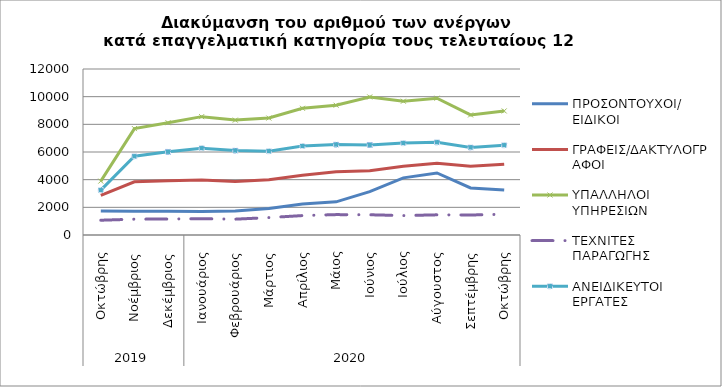
| Category | ΠΡΟΣΟΝΤΟΥΧΟΙ/  ΕΙΔΙΚΟΙ | ΓΡΑΦΕΙΣ/ΔΑΚΤΥΛΟΓΡΑΦΟΙ | ΥΠΑΛΛΗΛΟΙ ΥΠΗΡΕΣΙΩΝ | ΤΕΧΝΙΤΕΣ ΠΑΡΑΓΩΓΗΣ | ΑΝΕΙΔΙΚΕΥΤΟΙ ΕΡΓΑΤΕΣ |
|---|---|---|---|---|---|
| 0 | 1735 | 2865 | 3896 | 1068 | 3242 |
| 1 | 1719 | 3843 | 7692 | 1144 | 5690 |
| 2 | 1724 | 3914 | 8117 | 1155 | 6012 |
| 3 | 1702 | 3980 | 8556 | 1179 | 6279 |
| 4 | 1728 | 3859 | 8305 | 1145 | 6104 |
| 5 | 1918 | 4001 | 8454 | 1258 | 6062 |
| 6 | 2246 | 4325 | 9159 | 1405 | 6433 |
| 7 | 2398 | 4567 | 9381 | 1474 | 6537 |
| 8 | 3138 | 4651 | 9981 | 1463 | 6510 |
| 9 | 4130 | 4971 | 9672 | 1404 | 6642 |
| 10 | 4486 | 5193 | 9889 | 1458 | 6701 |
| 11 | 3399 | 4966 | 8680 | 1445 | 6331 |
| 12 | 3258 | 5110 | 8968 | 1502 | 6493 |